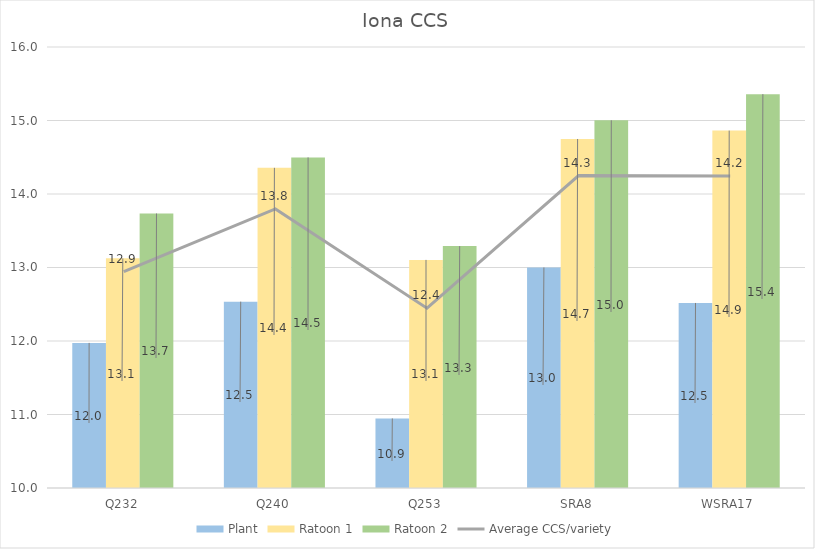
| Category | Plant | Ratoon 1 | Ratoon 2 |
|---|---|---|---|
| Q232 | 11.974 | 13.124 | 13.735 |
| Q240 | 12.535 | 14.356 | 14.498 |
| Q253 | 10.947 | 13.104 | 13.291 |
| SRA8 | 13 | 14.748 | 15.003 |
| WSRA17 | 12.518 | 14.863 | 15.359 |